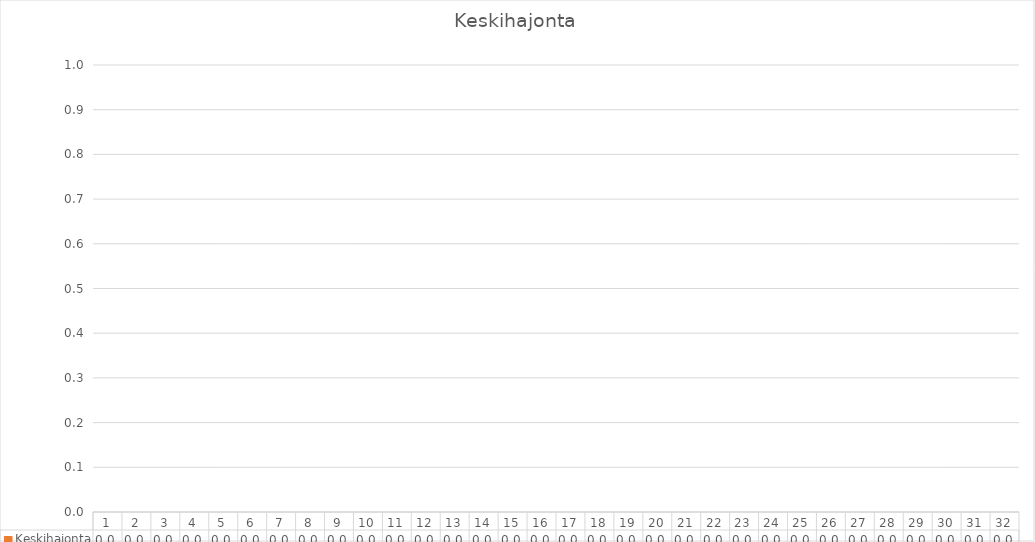
| Category | Keskihajonta |
|---|---|
| 0 | 0 |
| 1 | 0 |
| 2 | 0 |
| 3 | 0 |
| 4 | 0 |
| 5 | 0 |
| 6 | 0 |
| 7 | 0 |
| 8 | 0 |
| 9 | 0 |
| 10 | 0 |
| 11 | 0 |
| 12 | 0 |
| 13 | 0 |
| 14 | 0 |
| 15 | 0 |
| 16 | 0 |
| 17 | 0 |
| 18 | 0 |
| 19 | 0 |
| 20 | 0 |
| 21 | 0 |
| 22 | 0 |
| 23 | 0 |
| 24 | 0 |
| 25 | 0 |
| 26 | 0 |
| 27 | 0 |
| 28 | 0 |
| 29 | 0 |
| 30 | 0 |
| 31 | 0 |